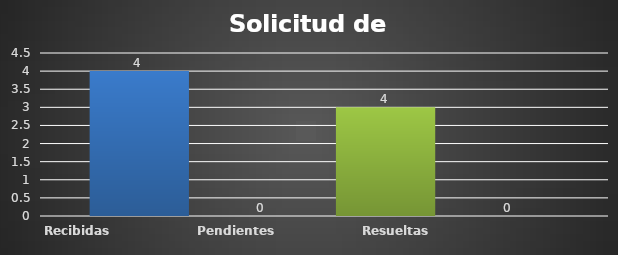
| Category | Recibidas  | Pendientes  | Resueltas | Rechazadas  |
|---|---|---|---|---|
| Recibidas  | 4 | 0 | 3 | 0 |